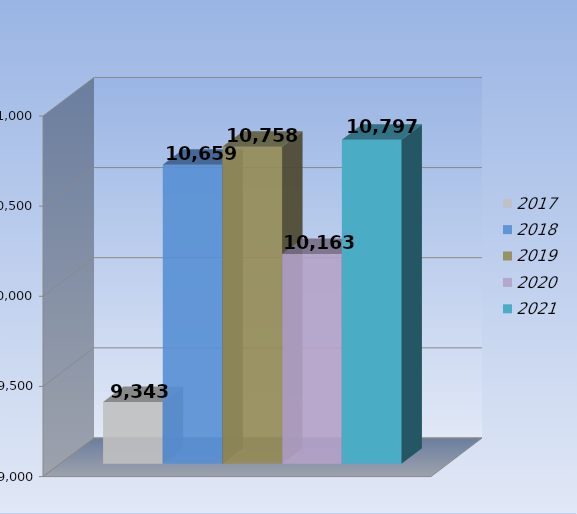
| Category | 2017 | 2018 | 2019 | 2020 | 2021 |
|---|---|---|---|---|---|
| 0 | 9343 | 10659 | 10758 | 10163 | 10797 |